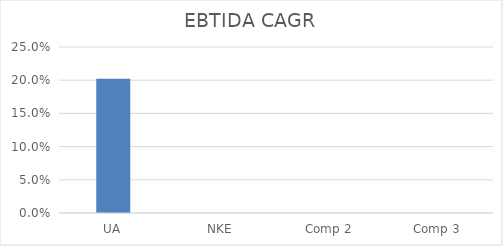
| Category | EBTIDA CAGR |
|---|---|
| UA | 0.202 |
| NKE | 0 |
| Comp 2 | 0 |
| Comp 3 | 0 |